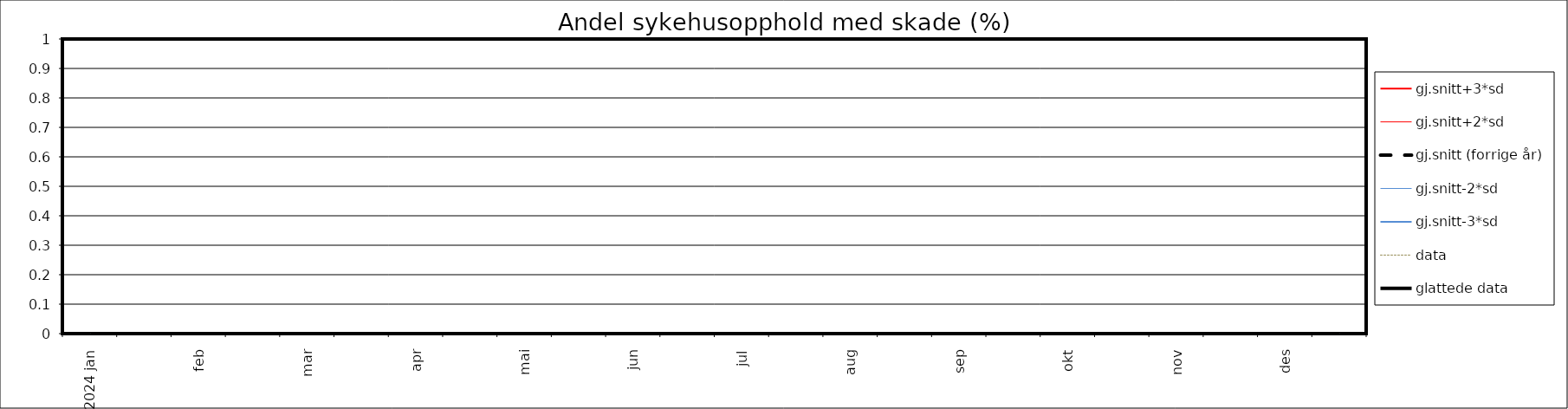
| Category | gj.snitt+3*sd | gj.snitt+2*sd | gj.snitt (forrige år) | gj.snitt-2*sd | gj.snitt-3*sd | data | glattede data |
|---|---|---|---|---|---|---|---|
| 2024 jan | 0 | 0 | 0 | 0 | 0 | 0 | 0 |
|  | 0 | 0 | 0 | 0 | 0 | 0 | 0 |
| feb | 0 | 0 | 0 | 0 | 0 | 0 | 0 |
|  | 0 | 0 | 0 | 0 | 0 | 0 | 0 |
| mar | 0 | 0 | 0 | 0 | 0 | 0 | 0 |
|  | 0 | 0 | 0 | 0 | 0 | 0 | 0 |
| apr | 0 | 0 | 0 | 0 | 0 | 0 | 0 |
|  | 0 | 0 | 0 | 0 | 0 | 0 | 0 |
| mai | 0 | 0 | 0 | 0 | 0 | 0 | 0 |
|  | 0 | 0 | 0 | 0 | 0 | 0 | 0 |
| jun | 0 | 0 | 0 | 0 | 0 | 0 | 0 |
|  | 0 | 0 | 0 | 0 | 0 | 0 | 0 |
| jul | 0 | 0 | 0 | 0 | 0 | 0 | 0 |
|  | 0 | 0 | 0 | 0 | 0 | 0 | 0 |
| aug | 0 | 0 | 0 | 0 | 0 | 0 | 0 |
|  | 0 | 0 | 0 | 0 | 0 | 0 | 0 |
| sep | 0 | 0 | 0 | 0 | 0 | 0 | 0 |
|  | 0 | 0 | 0 | 0 | 0 | 0 | 0 |
| okt | 0 | 0 | 0 | 0 | 0 | 0 | 0 |
|  | 0 | 0 | 0 | 0 | 0 | 0 | 0 |
| nov | 0 | 0 | 0 | 0 | 0 | 0 | 0 |
|  | 0 | 0 | 0 | 0 | 0 | 0 | 0 |
| des | 0 | 0 | 0 | 0 | 0 | 0 | 0 |